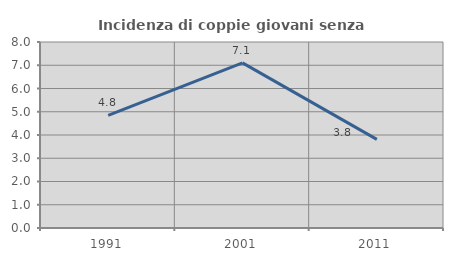
| Category | Incidenza di coppie giovani senza figli |
|---|---|
| 1991.0 | 4.845 |
| 2001.0 | 7.103 |
| 2011.0 | 3.813 |